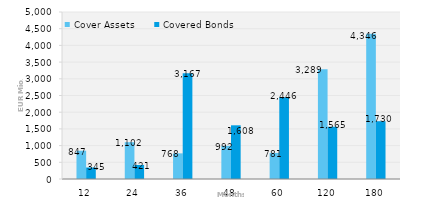
| Category | Cover Assets | Covered Bonds |
|---|---|---|
| 12.0 | 846.771 | 344.714 |
| 24.0 | 1101.747 | 420.5 |
| 36.0 | 767.511 | 3167.346 |
| 48.0 | 992.211 | 1607.5 |
| 60.0 | 780.965 | 2446.47 |
| 120.0 | 3288.645 | 1564.749 |
| 180.0 | 4346.274 | 1729.97 |